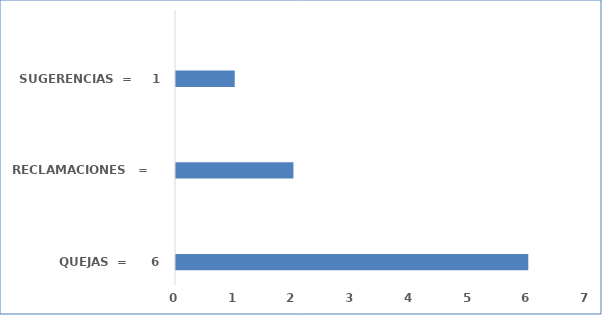
| Category | Series 0 |
|---|---|
|      QUEJAS  =      6 | 6 |
|  | 0 |
| RECLAMACIONES   =     2 | 2 |
|  | 0 |
| SUGERENCIAS  =     1 | 1 |
|  | 0 |